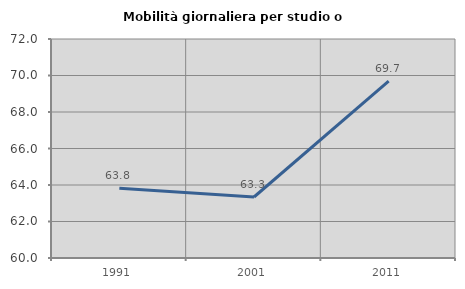
| Category | Mobilità giornaliera per studio o lavoro |
|---|---|
| 1991.0 | 63.823 |
| 2001.0 | 63.342 |
| 2011.0 | 69.692 |